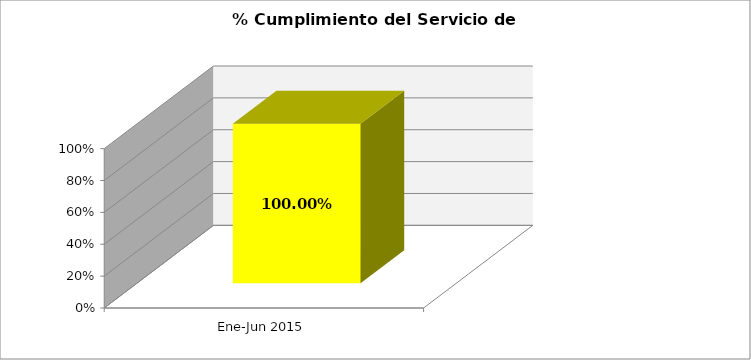
| Category | % |
|---|---|
| Ene-Jun 2015 | 1 |